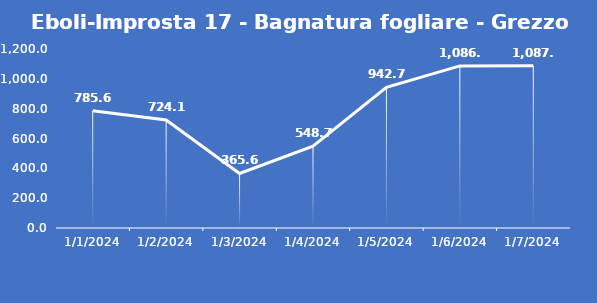
| Category | Eboli-Improsta 17 - Bagnatura fogliare - Grezzo (min) |
|---|---|
| 1/1/24 | 785.6 |
| 1/2/24 | 724.1 |
| 1/3/24 | 365.6 |
| 1/4/24 | 548.7 |
| 1/5/24 | 942.7 |
| 1/6/24 | 1086.8 |
| 1/7/24 | 1087.2 |